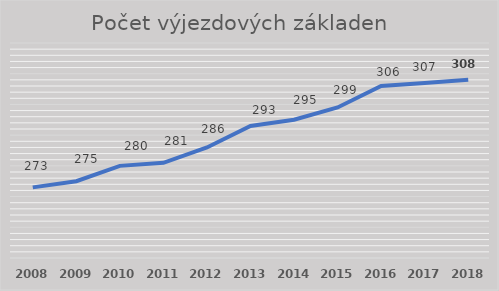
| Category | Počet výjezdových základen  |
|---|---|
| 2008.0 | 273 |
| 2009.0 | 275 |
| 2010.0 | 280 |
| 2011.0 | 281 |
| 2012.0 | 286 |
| 2013.0 | 293 |
| 2014.0 | 295 |
| 2015.0 | 299 |
| 2016.0 | 306 |
| 2017.0 | 307 |
| 2018.0 | 308 |